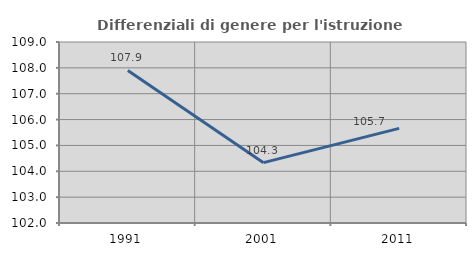
| Category | Differenziali di genere per l'istruzione superiore |
|---|---|
| 1991.0 | 107.901 |
| 2001.0 | 104.334 |
| 2011.0 | 105.661 |